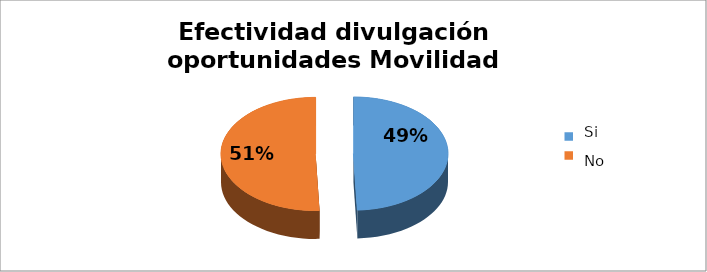
| Category | Series 0 |
|---|---|
| 0 | 0.493 |
| 1 | 0.507 |